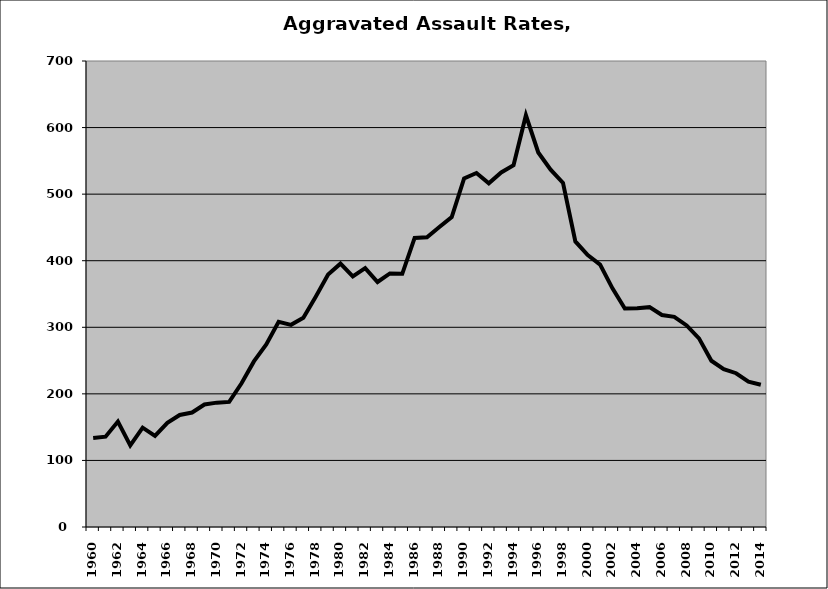
| Category | Aggravated Assault |
|---|---|
| 1960.0 | 133.834 |
| 1961.0 | 135.699 |
| 1962.0 | 158.319 |
| 1963.0 | 122.717 |
| 1964.0 | 149.223 |
| 1965.0 | 136.725 |
| 1966.0 | 156.407 |
| 1967.0 | 168.282 |
| 1968.0 | 172.007 |
| 1969.0 | 184.005 |
| 1970.0 | 186.81 |
| 1971.0 | 187.915 |
| 1972.0 | 215.865 |
| 1973.0 | 248.745 |
| 1974.0 | 274.216 |
| 1975.0 | 308.147 |
| 1976.0 | 303.669 |
| 1977.0 | 314.317 |
| 1978.0 | 345.931 |
| 1979.0 | 379.154 |
| 1980.0 | 395.621 |
| 1981.0 | 376.325 |
| 1982.0 | 388.845 |
| 1983.0 | 368.039 |
| 1984.0 | 380.931 |
| 1985.0 | 380.338 |
| 1986.0 | 434.258 |
| 1987.0 | 435.158 |
| 1988.0 | 450.624 |
| 1989.0 | 465.44 |
| 1990.0 | 523.594 |
| 1991.0 | 531.811 |
| 1992.0 | 516.353 |
| 1993.0 | 532.598 |
| 1994.0 | 543.303 |
| 1995.0 | 618.453 |
| 1996.0 | 562.581 |
| 1997.0 | 536.668 |
| 1998.0 | 516.903 |
| 1999.0 | 428.912 |
| 2000.0 | 408.485 |
| 2001.0 | 394.138 |
| 2002.0 | 358.433 |
| 2003.0 | 328.134 |
| 2004.0 | 328.689 |
| 2005.0 | 330.251 |
| 2006.0 | 318.408 |
| 2007.0 | 315.681 |
| 2008.0 | 302.726 |
| 2009.0 | 283.399 |
| 2010.0 | 249.73 |
| 2011.0 | 237.135 |
| 2012.0 | 230.996 |
| 2013.0 | 218.462 |
| 2014.0 | 213.655 |